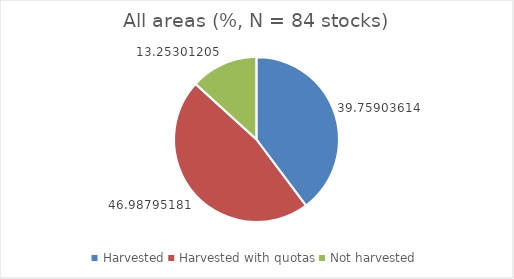
| Category | All areas (%, N = 84 stocks) |
|---|---|
| Harvested | 39.759 |
| Harvested with quotas | 46.988 |
| Not harvested | 13.253 |